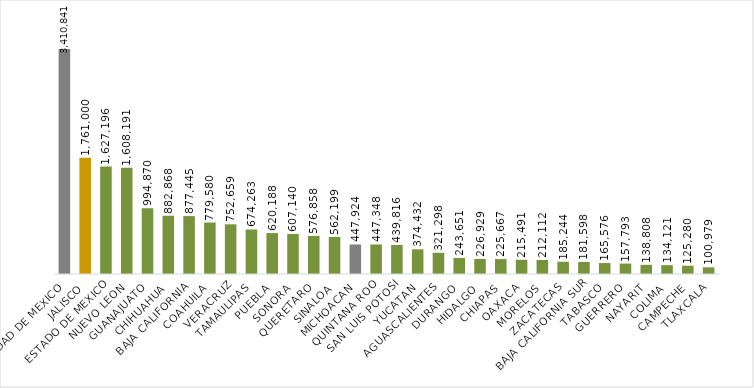
| Category | Series 0 |
|---|---|
| CIUDAD DE MEXICO | 3410841 |
| JALISCO | 1761000 |
| ESTADO DE MEXICO | 1627196 |
| NUEVO LEON | 1608191 |
| GUANAJUATO | 994870 |
| CHIHUAHUA | 882868 |
| BAJA CALIFORNIA | 877445 |
| COAHUILA | 779580 |
| VERACRUZ | 752659 |
| TAMAULIPAS | 674263 |
| PUEBLA | 620188 |
| SONORA | 607140 |
| QUERETARO | 576858 |
| SINALOA | 562199 |
| MICHOACAN | 447924 |
| QUINTANA ROO | 447348 |
| SAN LUIS POTOSI | 439816 |
| YUCATAN | 374432 |
| AGUASCALIENTES | 321298 |
| DURANGO | 243651 |
| HIDALGO | 226929 |
| CHIAPAS | 225667 |
| OAXACA | 215491 |
| MORELOS | 212112 |
| ZACATECAS | 185244 |
| BAJA CALIFORNIA SUR | 181598 |
| TABASCO | 165576 |
| GUERRERO | 157793 |
| NAYARIT | 138808 |
| COLIMA | 134121 |
| CAMPECHE | 125280 |
| TLAXCALA | 100979 |